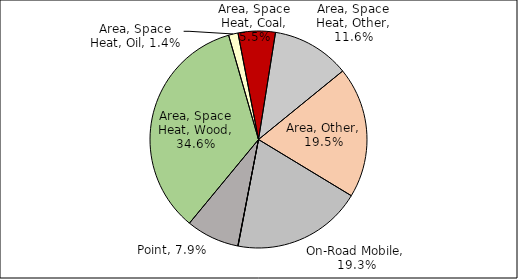
| Category | Series 0 |
|---|---|
| Point | 0.079 |
| Area, Space Heat, Wood | 0.346 |
| Area, Space Heat, Oil | 0.014 |
| Area, Space Heat, Coal | 0.055 |
| Area, Space Heat, Other | 0.116 |
| Area, Other | 0.195 |
| On-Road Mobile | 0.193 |
| Non-Road Mobile | 0 |